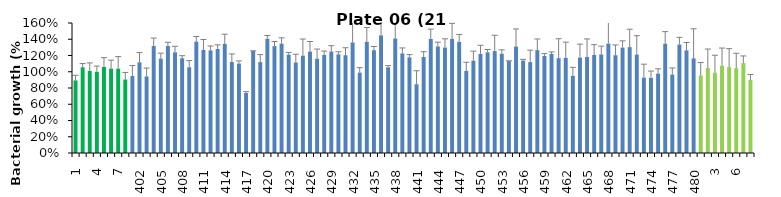
| Category | 21 h % |
|---|---|
| 1.0 | 0.894 |
| 2.0 | 1.055 |
| 3.0 | 1.01 |
| 4.0 | 1 |
| 5.0 | 1.059 |
| 6.0 | 1.039 |
| 7.0 | 1.039 |
| 8.0 | 0.905 |
| 401.0 | 0.947 |
| 402.0 | 1.116 |
| 403.0 | 0.943 |
| 404.0 | 1.317 |
| 405.0 | 1.161 |
| 406.0 | 1.318 |
| 407.0 | 1.239 |
| 408.0 | 1.166 |
| 409.0 | 1.055 |
| 410.0 | 1.371 |
| 411.0 | 1.269 |
| 412.0 | 1.263 |
| 413.0 | 1.28 |
| 414.0 | 1.344 |
| 415.0 | 1.12 |
| 416.0 | 1.101 |
| 417.0 | 0.739 |
| 418.0 | 1.256 |
| 419.0 | 1.119 |
| 420.0 | 1.407 |
| 421.0 | 1.315 |
| 422.0 | 1.346 |
| 423.0 | 1.211 |
| 424.0 | 1.114 |
| 425.0 | 1.198 |
| 426.0 | 1.248 |
| 427.0 | 1.16 |
| 428.0 | 1.207 |
| 429.0 | 1.249 |
| 430.0 | 1.214 |
| 431.0 | 1.204 |
| 432.0 | 1.36 |
| 433.0 | 0.989 |
| 434.0 | 1.368 |
| 435.0 | 1.265 |
| 436.0 | 1.448 |
| 437.0 | 1.054 |
| 438.0 | 1.41 |
| 439.0 | 1.226 |
| 440.0 | 1.177 |
| 441.0 | 0.846 |
| 442.0 | 1.181 |
| 443.0 | 1.404 |
| 444.0 | 1.312 |
| 445.0 | 1.297 |
| 446.0 | 1.404 |
| 447.0 | 1.368 |
| 448.0 | 1.01 |
| 449.0 | 1.136 |
| 450.0 | 1.22 |
| 451.0 | 1.239 |
| 452.0 | 1.254 |
| 453.0 | 1.222 |
| 454.0 | 1.131 |
| 455.0 | 1.31 |
| 456.0 | 1.138 |
| 457.0 | 1.119 |
| 458.0 | 1.266 |
| 459.0 | 1.194 |
| 460.0 | 1.219 |
| 461.0 | 1.167 |
| 462.0 | 1.171 |
| 463.0 | 0.949 |
| 464.0 | 1.174 |
| 465.0 | 1.181 |
| 466.0 | 1.206 |
| 467.0 | 1.213 |
| 468.0 | 1.347 |
| 469.0 | 1.204 |
| 470.0 | 1.297 |
| 471.0 | 1.303 |
| 472.0 | 1.211 |
| 473.0 | 0.928 |
| 474.0 | 0.925 |
| 475.0 | 0.977 |
| 476.0 | 1.345 |
| 477.0 | 0.965 |
| 478.0 | 1.335 |
| 479.0 | 1.264 |
| 480.0 | 1.165 |
| 1.0 | 0.954 |
| 2.0 | 1.047 |
| 3.0 | 0.988 |
| 4.0 | 1.076 |
| 5.0 | 1.057 |
| 6.0 | 1.044 |
| 7.0 | 1.107 |
| 8.0 | 0.901 |